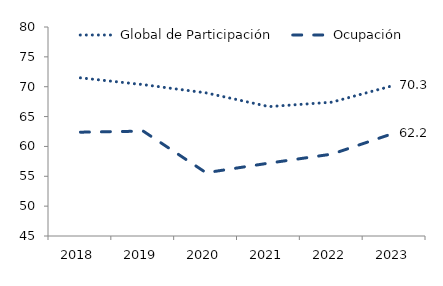
| Category | Global de Participación | Ocupación |
|---|---|---|
| 2018.0 | 71.486 | 62.385 |
| 2019.0 | 70.347 | 62.562 |
| 2020.0 | 68.968 | 55.596 |
| 2021.0 | 66.668 | 57.205 |
| 2022.0 | 67.408 | 58.706 |
| 2023.0 | 70.254 | 62.249 |